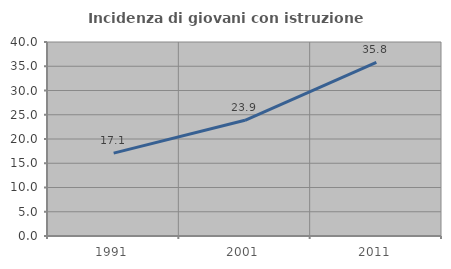
| Category | Incidenza di giovani con istruzione universitaria |
|---|---|
| 1991.0 | 17.085 |
| 2001.0 | 23.853 |
| 2011.0 | 35.811 |